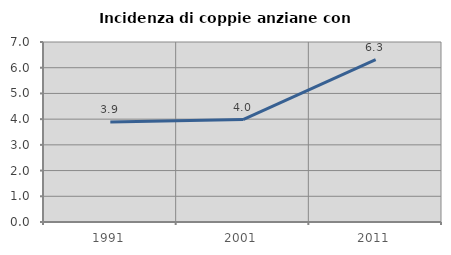
| Category | Incidenza di coppie anziane con figli |
|---|---|
| 1991.0 | 3.889 |
| 2001.0 | 3.985 |
| 2011.0 | 6.312 |